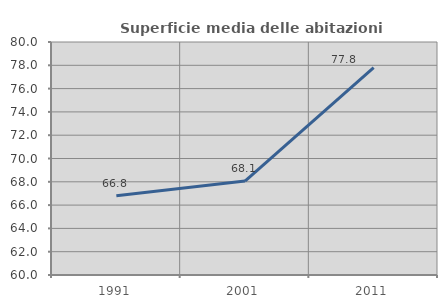
| Category | Superficie media delle abitazioni occupate |
|---|---|
| 1991.0 | 66.8 |
| 2001.0 | 68.064 |
| 2011.0 | 77.791 |